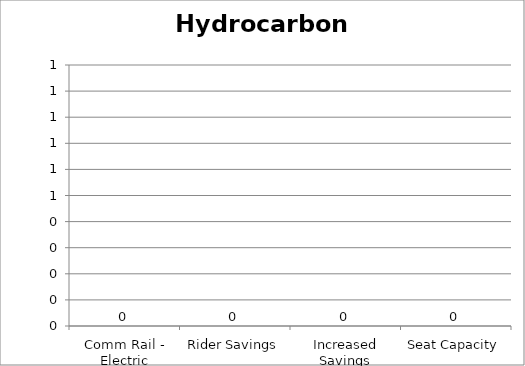
| Category | Hydrocarbons |
|---|---|
| Comm Rail - Electric | 0 |
| Rider Savings | 0 |
| Increased Savings | 0 |
| Seat Capacity | 0 |